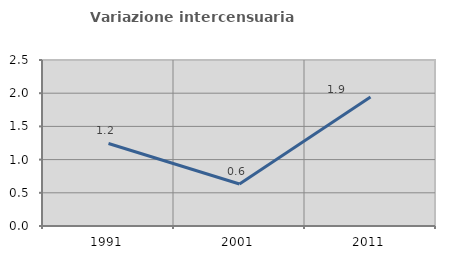
| Category | Variazione intercensuaria annua |
|---|---|
| 1991.0 | 1.243 |
| 2001.0 | 0.632 |
| 2011.0 | 1.944 |